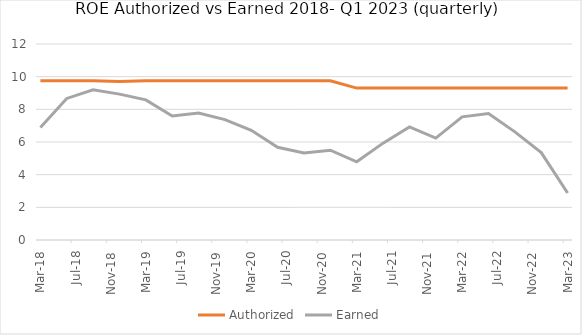
| Category | Authorized | Earned |
|---|---|---|
| 2018-03-01 | 9.75 | 6.891 |
| 2018-06-01 | 9.75 | 8.667 |
| 2018-09-01 | 9.75 | 9.197 |
| 2018-12-01 | 9.7 | 8.932 |
| 2019-03-01 | 9.75 | 8.578 |
| 2019-06-01 | 9.75 | 7.596 |
| 2019-09-01 | 9.75 | 7.78 |
| 2019-12-01 | 9.75 | 7.37 |
| 2020-03-01 | 9.75 | 6.72 |
| 2020-06-01 | 9.75 | 5.68 |
| 2020-09-01 | 9.75 | 5.33 |
| 2020-12-01 | 9.75 | 5.5 |
| 2021-03-01 | 9.3 | 4.79 |
| 2021-06-01 | 9.3 | 5.93 |
| 2021-09-01 | 9.3 | 6.92 |
| 2021-12-01 | 9.3 | 6.24 |
| 2022-03-01 | 9.3 | 7.54 |
| 2022-06-01 | 9.3 | 7.74 |
| 2022-09-01 | 9.3 | 6.62 |
| 2022-12-01 | 9.3 | 5.35 |
| 2023-03-01 | 9.3 | 2.88 |